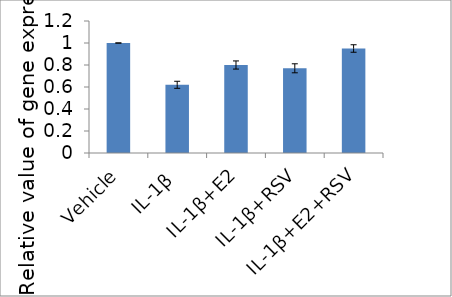
| Category | Series 0 |
|---|---|
| Vehicle | 1 |
| IL-1β | 0.62 |
| IL-1β+E2 | 0.8 |
| IL-1β+RSV | 0.77 |
| IL-1β+E2+RSV | 0.95 |